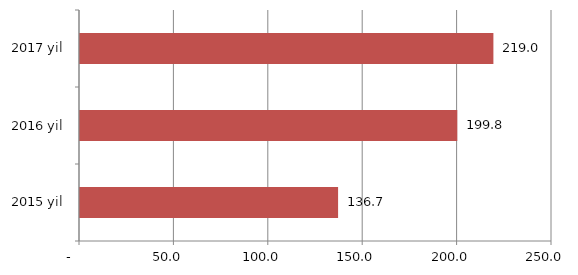
| Category | Series 0 |
|---|---|
| 2015 yil | 136.7 |
| 2016 yil | 199.84 |
| 2017 yil | 218.96 |